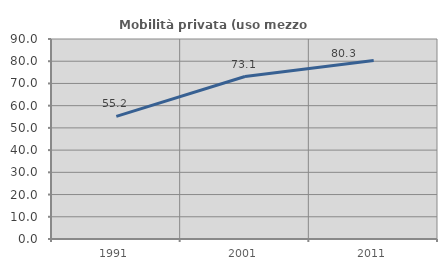
| Category | Mobilità privata (uso mezzo privato) |
|---|---|
| 1991.0 | 55.163 |
| 2001.0 | 73.104 |
| 2011.0 | 80.347 |